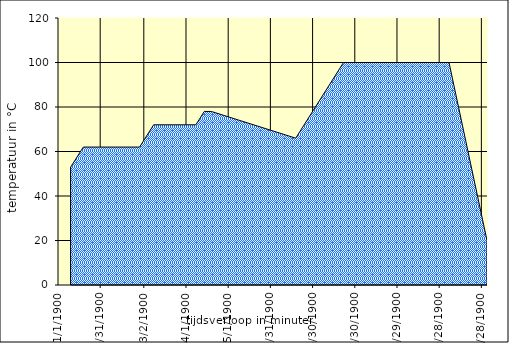
| Category | Maischschema grafisch |
|---|---|
| 0.0 | 53 |
| 0.0 | 53 |
| 0.0 | 53 |
| 10.0 | 53 |
| 19.0 | 62 |
| 59.0 | 62 |
| 69.0 | 72 |
| 99.0 | 72 |
| 105.0 | 78 |
| 110.0 | 78 |
| 110.0 | 78 |
| 170.0 | 66 |
| 204.0 | 100 |
| 279.0 | 100 |
| 279.0 | 100 |
| 305.6666666666667 | 20 |